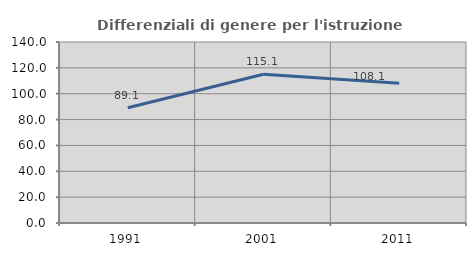
| Category | Differenziali di genere per l'istruzione superiore |
|---|---|
| 1991.0 | 89.119 |
| 2001.0 | 115.109 |
| 2011.0 | 108.06 |